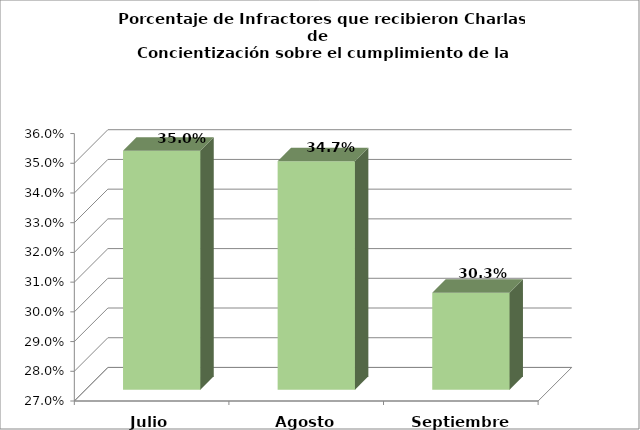
| Category | Series 0 |
|---|---|
| Julio | 0.35 |
| Agosto | 0.347 |
| Septiembre | 0.303 |